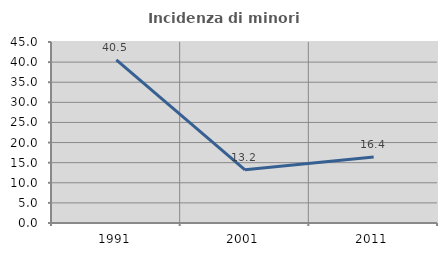
| Category | Incidenza di minori stranieri |
|---|---|
| 1991.0 | 40.541 |
| 2001.0 | 13.223 |
| 2011.0 | 16.381 |